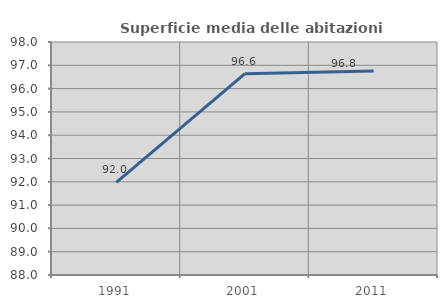
| Category | Superficie media delle abitazioni occupate |
|---|---|
| 1991.0 | 91.973 |
| 2001.0 | 96.64 |
| 2011.0 | 96.755 |